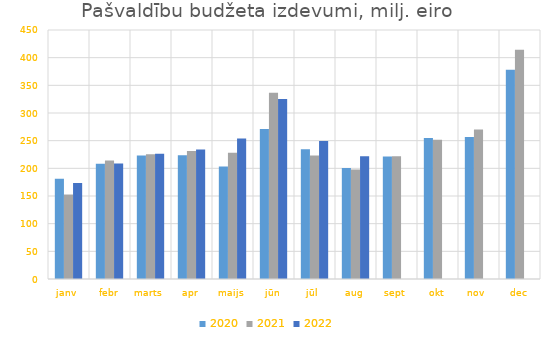
| Category | 2020 | 2021 | 2022 |
|---|---|---|---|
| janv | 181241.02 | 152675.552 | 173548.423 |
| febr | 208405.475 | 213940.448 | 208650.357 |
| marts | 223138.505 | 225624.876 | 226166.321 |
| apr | 223577 | 231146.925 | 234145.666 |
| maijs | 203504.23 | 228193.448 | 253995.943 |
| jūn | 271297.77 | 336561.936 | 325201.018 |
| jūl | 234617.887 | 223275.425 | 249623.438 |
| aug | 200617.365 | 197904.39 | 221979.814 |
| sept | 221574.112 | 221712.162 | 0 |
| okt | 254993.621 | 251718.671 | 0 |
| nov | 256741.926 | 270071.167 | 0 |
| dec | 378007.978 | 414250.751 | 0 |